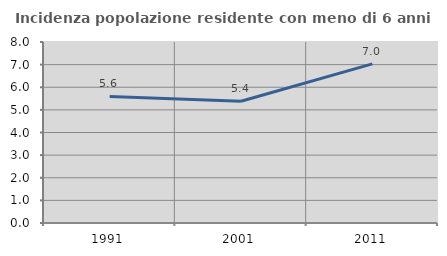
| Category | Incidenza popolazione residente con meno di 6 anni |
|---|---|
| 1991.0 | 5.593 |
| 2001.0 | 5.383 |
| 2011.0 | 7.032 |